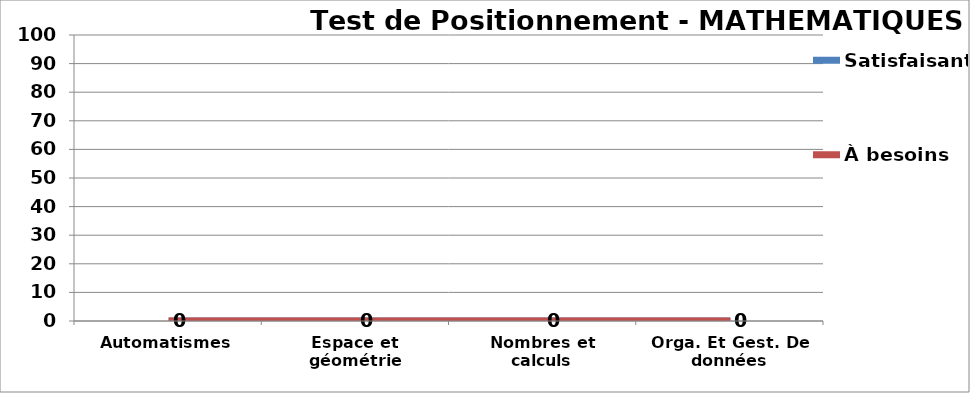
| Category | Satisfaisant | À besoins |
|---|---|---|
| Automatismes | 0 | 0 |
| Espace et géométrie | 0 | 0 |
| Nombres et calculs | 0 | 0 |
| Orga. Et Gest. De données | 0 | 0 |